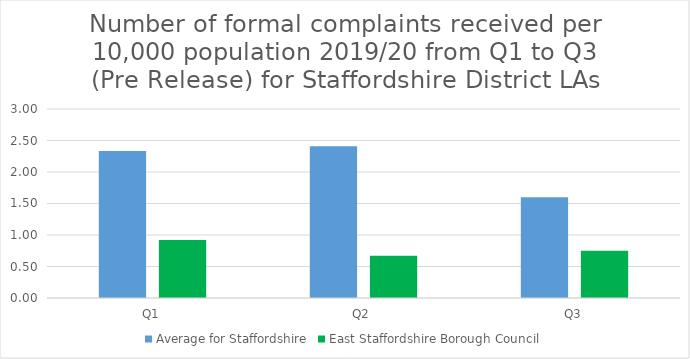
| Category | Average for Staffordshire | East Staffordshire Borough Council |
|---|---|---|
| Q1 | 2.332 | 0.92 |
| Q2 | 2.41 | 0.67 |
| Q3 | 1.6 | 0.75 |